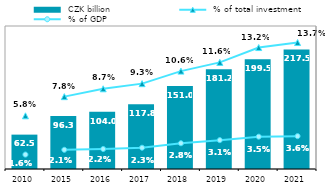
| Category |  CZK billion |
|---|---|
| 2010.0 | 62.501 |
| 2015.0 | 96.27 |
| 2016.0 | 104.02 |
| 2017.0 | 117.816 |
| 2018.0 | 150.99 |
| 2019.0 | 181.171 |
| 2020.0 | 199.524 |
| 2021.0 | 217.45 |